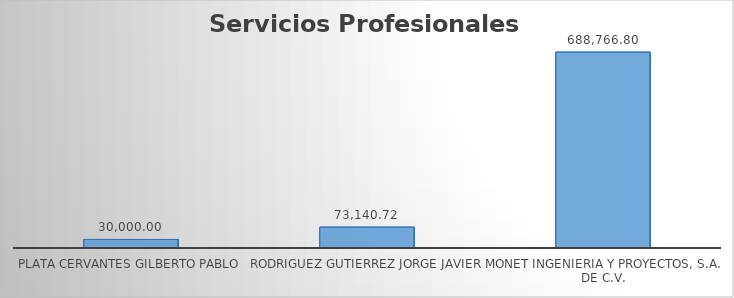
| Category | SUMA |
|---|---|
| PLATA CERVANTES GILBERTO PABLO | 30000 |
| RODRIGUEZ GUTIERREZ JORGE JAVIER | 73140.72 |
| MONET INGENIERIA Y PROYECTOS, S.A. DE C.V. | 688766.8 |